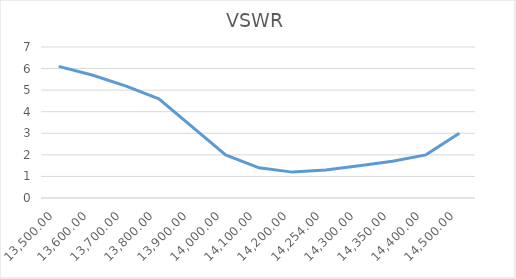
| Category | VSWR |
|---|---|
| 13500.0 | 6.1 |
| 13600.0 | 5.7 |
| 13700.0 | 5.2 |
| 13800.0 | 4.6 |
| 13900.0 | 3.3 |
| 14000.0 | 2 |
| 14100.0 | 1.4 |
| 14200.0 | 1.2 |
| 14254.0 | 1.3 |
| 14300.0 | 1.5 |
| 14350.0 | 1.7 |
| 14400.0 | 2 |
| 14500.0 | 3 |